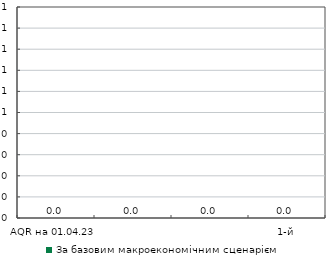
| Category | За базовим макроекономічним сценарієм |
|---|---|
| AQR на 01.04.23 | 0 |
| 1-й | 0 |
| 2-й | 0 |
| 3-й | 0 |